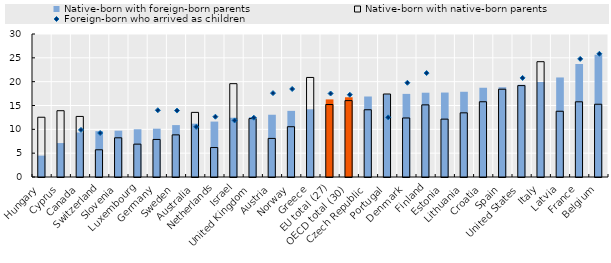
| Category | Native-born with foreign-born parents | Native-born with native-born parents |
|---|---|---|
| Hungary | 4.485 | 12.537 |
| Cyprus | 7.124 | 13.907 |
| Canada | 9.331 | 12.706 |
| Switzerland | 9.62 | 5.71 |
| Slovenia | 9.719 | 8.224 |
| Luxembourg | 10.018 | 6.895 |
| Germany | 10.138 | 7.879 |
| Sweden | 10.892 | 8.838 |
| Australia | 11.195 | 13.557 |
| Netherlands | 11.628 | 6.179 |
| Israel | 12.43 | 19.58 |
| United Kingdom | 12.57 | 12.25 |
| Austria | 13.062 | 8.093 |
| Norway | 13.876 | 10.547 |
| Greece | 14.207 | 20.886 |
| EU total (27) | 16.281 | 15.207 |
| OECD total (30) | 16.729 | 16.023 |
| Czech Republic | 16.889 | 14.106 |
| Portugal | 17.37 | 17.41 |
| Denmark | 17.436 | 12.384 |
| Finland | 17.683 | 15.133 |
| Estonia | 17.715 | 12.141 |
| Lithuania | 17.881 | 13.461 |
| Croatia | 18.723 | 15.784 |
| Spain | 18.831 | 18.417 |
| United States | 19.376 | 19.174 |
| Italy | 19.931 | 24.189 |
| Latvia | 20.882 | 13.792 |
| France | 23.723 | 15.775 |
| Belgium | 25.661 | 15.263 |